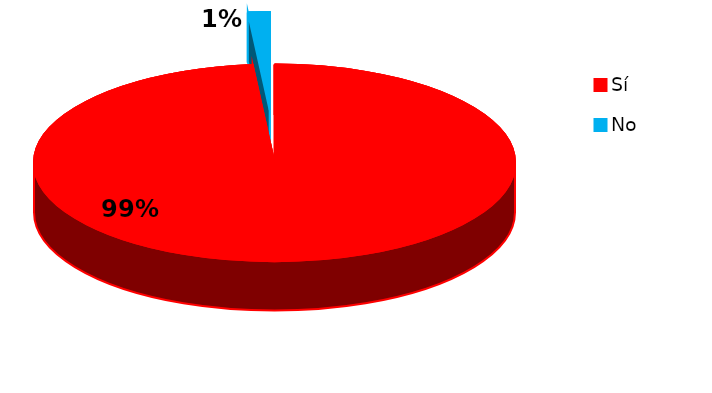
| Category | Series 0 |
|---|---|
| 0 | 136 |
| 1 | 2 |